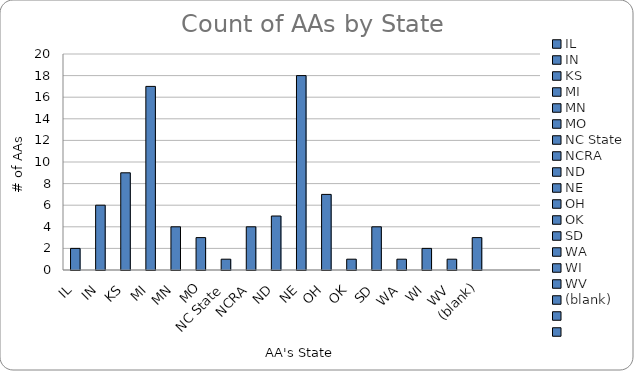
| Category | Series 0 |
|---|---|
| IL | 2 |
| IN | 6 |
| KS | 9 |
| MI | 17 |
| MN | 4 |
| MO | 3 |
| NC State | 1 |
| NCRA | 4 |
| ND | 5 |
| NE | 18 |
| OH | 7 |
| OK | 1 |
| SD | 4 |
| WA | 1 |
| WI | 2 |
| WV | 1 |
| (blank) | 3 |